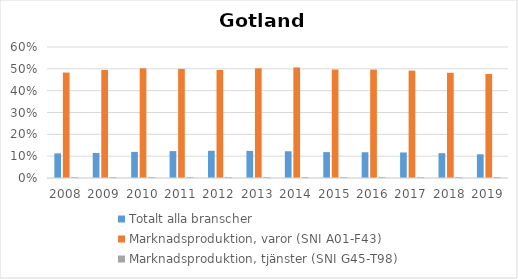
| Category | Totalt alla branscher | Marknadsproduktion, varor (SNI A01-F43) | Marknadsproduktion, tjänster (SNI G45-T98) |
|---|---|---|---|
| 2008.0 | 0.113 | 0.483 | 0.004 |
| 2009.0 | 0.115 | 0.495 | 0.004 |
| 2010.0 | 0.12 | 0.502 | 0.005 |
| 2011.0 | 0.123 | 0.5 | 0.004 |
| 2012.0 | 0.125 | 0.495 | 0.004 |
| 2013.0 | 0.124 | 0.503 | 0.004 |
| 2014.0 | 0.123 | 0.506 | 0.005 |
| 2015.0 | 0.119 | 0.497 | 0.005 |
| 2016.0 | 0.118 | 0.496 | 0.004 |
| 2017.0 | 0.117 | 0.492 | 0.004 |
| 2018.0 | 0.114 | 0.482 | 0.004 |
| 2019.0 | 0.109 | 0.477 | 0.004 |